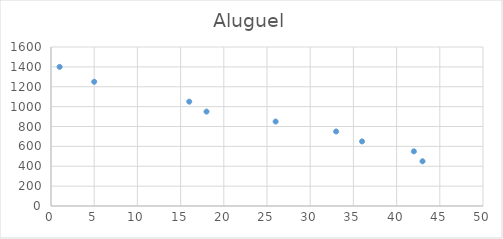
| Category | Aluguel |
|---|---|
| 43.0 | 450 |
| 42.0 | 550 |
| 36.0 | 650 |
| 33.0 | 750 |
| 26.0 | 850 |
| 18.0 | 950 |
| 16.0 | 1050 |
| 5.0 | 1250 |
| 1.0 | 1400 |